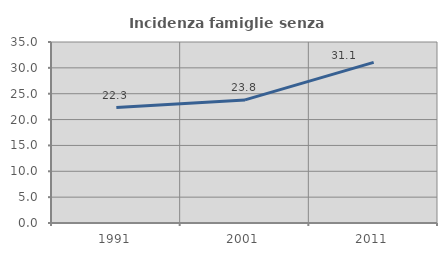
| Category | Incidenza famiglie senza nuclei |
|---|---|
| 1991.0 | 22.317 |
| 2001.0 | 23.801 |
| 2011.0 | 31.064 |